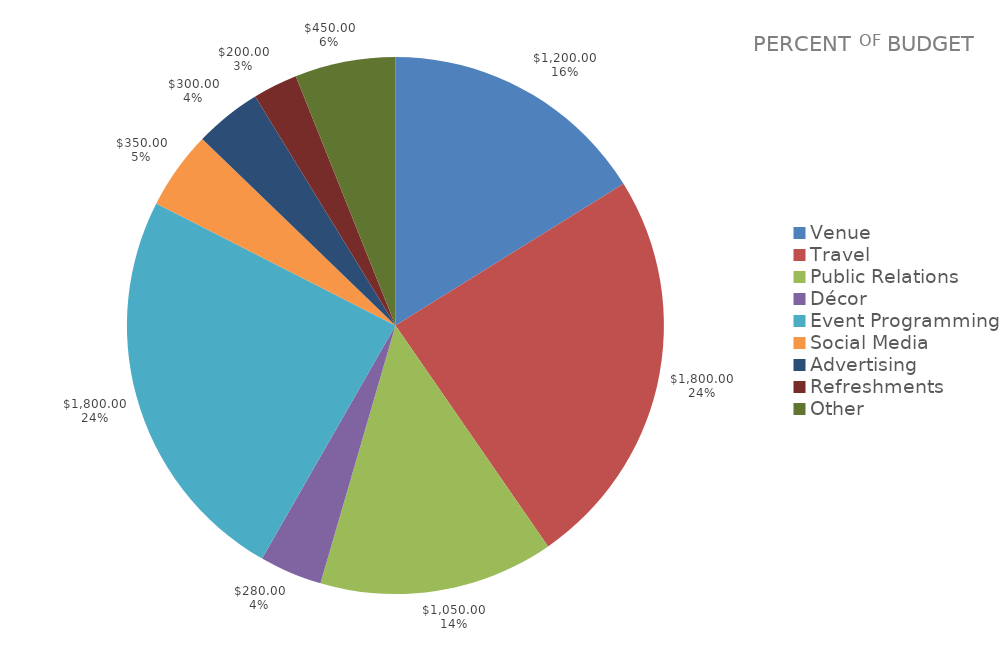
| Category | Series 0 | Series 1 |
|---|---|---|
| Venue | 1200 | 0.162 |
| Travel | 1800 | 0.242 |
| Public Relations | 1050 | 0.141 |
| Décor | 280 | 0.038 |
| Event Programming | 1800 | 0.242 |
| Social Media | 350 | 0.047 |
| Advertising | 300 | 0.04 |
| Refreshments | 200 | 0.027 |
| Other | 450 | 0.061 |